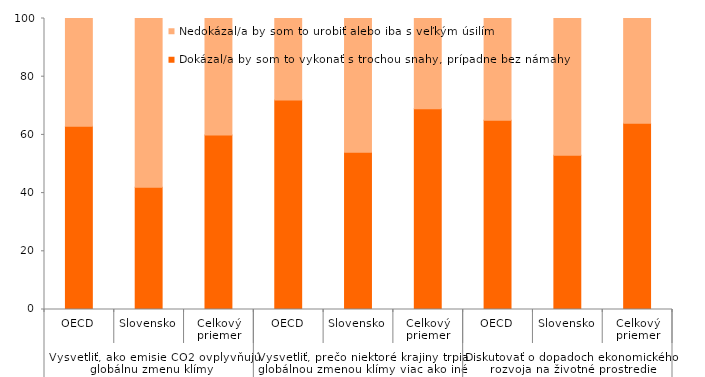
| Category | Dokázal/a by som to vykonať s trochou snahy, prípadne bez námahy | Nedokázal/a by som to urobiť alebo iba s veľkým úsilím |
|---|---|---|
| 0 | 63 | 37 |
| 1 | 42 | 58 |
| 2 | 60 | 40 |
| 3 | 72 | 28 |
| 4 | 54 | 46 |
| 5 | 69 | 31 |
| 6 | 65 | 35 |
| 7 | 53 | 47 |
| 8 | 64 | 36 |